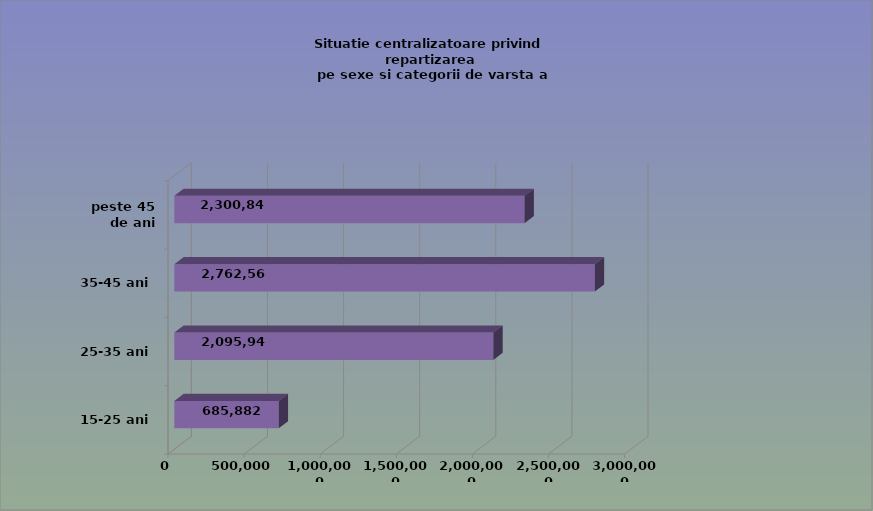
| Category | 15-25 ani 25-35 ani 35-45 ani peste 45 de ani |
|---|---|
| 15-25 ani | 685882 |
| 25-35 ani | 2095947 |
| 35-45 ani | 2762568 |
| peste 45 de ani | 2300841 |